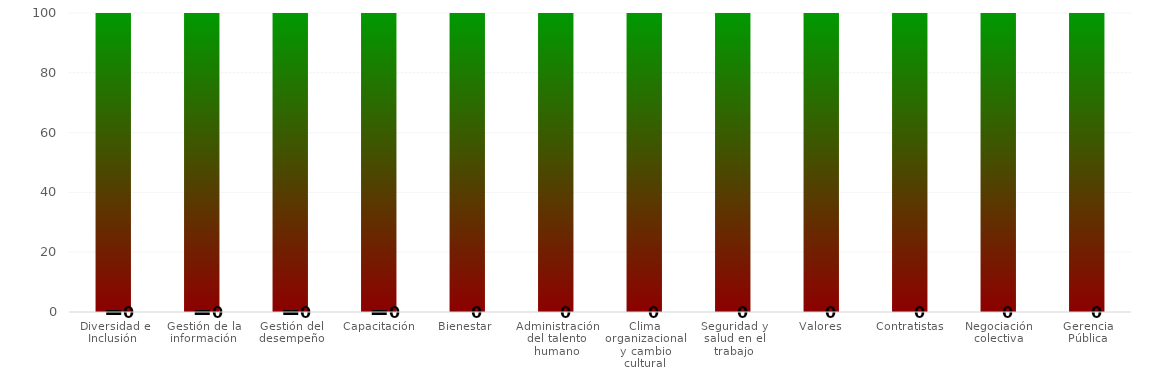
| Category | Niveles |
|---|---|
| Diversidad e Inclusión  | 100 |
| Gestión de la información | 100 |
| Gestión del desempeño | 100 |
| Capacitación | 100 |
| Bienestar  | 100 |
| Administración del talento humano | 100 |
| Clima organizacional y cambio cultural | 100 |
| Seguridad y salud en el trabajo | 100 |
| Valores | 100 |
| Contratistas | 100 |
| Negociación colectiva | 100 |
| Gerencia Pública | 100 |